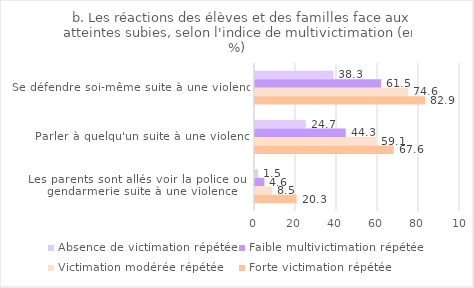
| Category | Absence de victimation répétée | Faible multivictimation répétée | Victimation modérée répétée | Forte victimation répétée |
|---|---|---|---|---|
| Se défendre soi-même suite à une violence | 38.275 | 61.532 | 74.638 | 82.909 |
| Parler à quelqu'un suite à une violence | 24.712 | 44.277 | 59.112 | 67.613 |
| Les parents sont allés voir la police ou la gendarmerie suite à une violence | 1.492 | 4.598 | 8.478 | 20.277 |